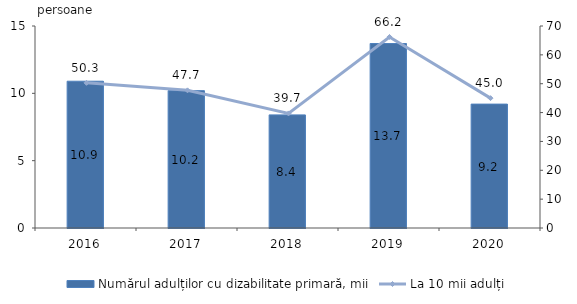
| Category | Numărul adulților cu dizabilitate primară, mii |
|---|---|
| 2016.0 | 10.9 |
| 2017.0 | 10.2 |
| 2018.0 | 8.4 |
| 2019.0 | 13.7 |
| 2020.0 | 9.2 |